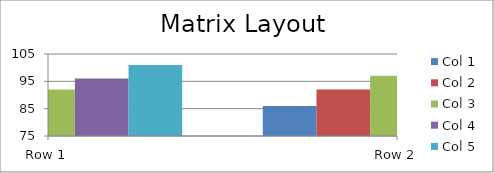
| Category | Col 1 | Col 2 | Col 3 | Col 4 | Col 5 |
|---|---|---|---|---|---|
| Row 1 | 100 | 88 | 92 | 96 | 101 |
| Row 2 | 86 | 92 | 97 | 92 | 86 |